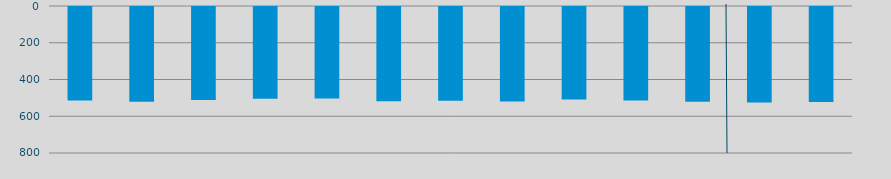
| Category | Energía a bajar | Energía a subir |
|---|---|---|
| F | 509.483 |  |
| M | 516.164 |  |
| A | 505.701 |  |
| M | 499.501 |  |
| J | 497.646 |  |
| J | 513.091 |  |
| A | 509.948 |  |
| S | 514.59 |  |
| O | 502.757 |  |
| N | 509.389 |  |
| D | 515.349 |  |
| E | 520.032 |  |
| F | 516.897 |  |